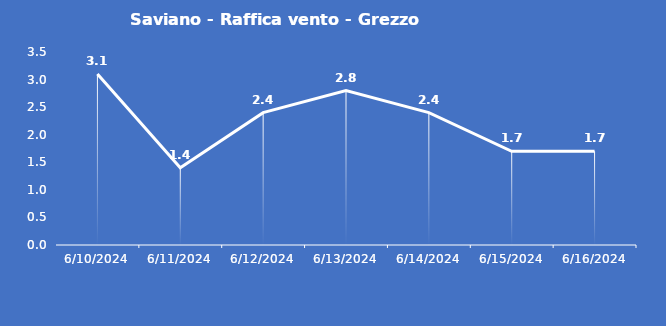
| Category | Saviano - Raffica vento - Grezzo (m/s) |
|---|---|
| 6/10/24 | 3.1 |
| 6/11/24 | 1.4 |
| 6/12/24 | 2.4 |
| 6/13/24 | 2.8 |
| 6/14/24 | 2.4 |
| 6/15/24 | 1.7 |
| 6/16/24 | 1.7 |